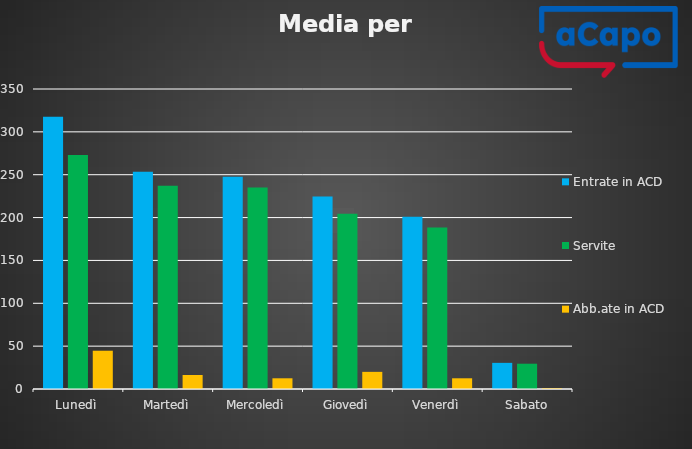
| Category | Entrate in ACD | Servite | Abb.ate in ACD |
|---|---|---|---|
| Lunedì | 317.667 | 273 | 44.667 |
| Martedì | 253.333 | 237 | 16.333 |
| Mercoledì | 247.5 | 235 | 12.5 |
| Giovedì | 224.5 | 204.5 | 20 |
| Venerdì | 201 | 188.5 | 12.5 |
| Sabato | 30.5 | 29.5 | 1 |